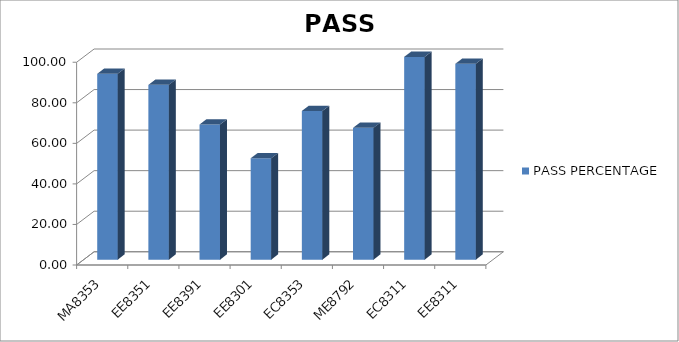
| Category | PASS PERCENTAGE |
|---|---|
| MA8353 | 91.667 |
| EE8351 | 86.207 |
| EE8391 | 66.667 |
| EE8301 | 50 |
| EC8353 | 73.333 |
| ME8792 | 65 |
| EC8311 | 100 |
| EE8311 | 96.61 |